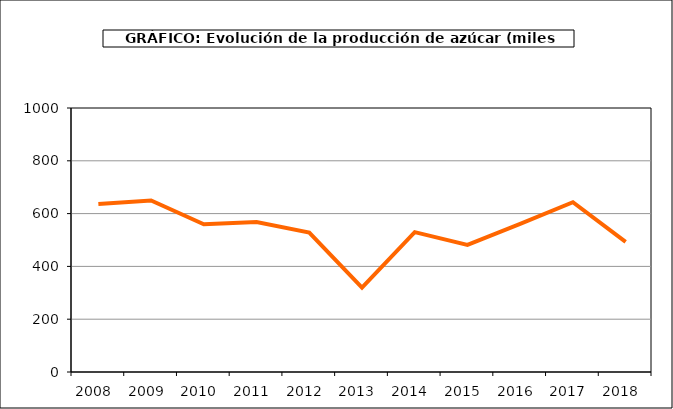
| Category | Producción |
|---|---|
| 2008.0 | 636.459 |
| 2009.0 | 649.935 |
| 2010.0 | 559.795 |
| 2011.0 | 567.722 |
| 2012.0 | 528.414 |
| 2013.0 | 319.237 |
| 2014.0 | 529.794 |
| 2015.0 | 481.569 |
| 2016.0 | 560.897 |
| 2017.0 | 642.971 |
| 2018.0 | 493.179 |